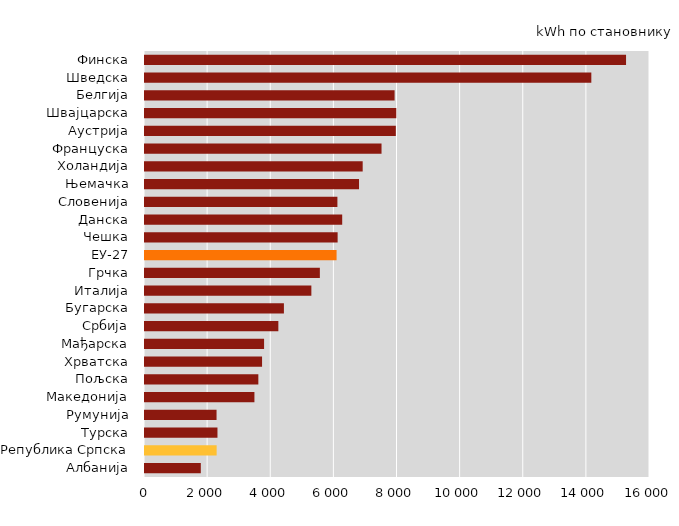
| Category | Electricity Consumption / Population(kWh/capita)2009 |
|---|---|
| Албанија | 1768 |
| Република Српска | 2270 |
| Турска | 2296 |
| Румунија | 2267 |
| Македонија | 3467 |
| Пољска | 3591 |
| Хрватска | 3709 |
| Мађарска | 3773 |
| Србија | 4225 |
| Бугарска | 4401 |
| Италија | 5271 |
| Грчка | 5540 |
| ЕУ-27 | 6070 |
| Чешка | 6103 |
| Данска | 6248 |
| Словенија | 6096 |
| Њемачка | 6781 |
| Холандија | 6897 |
| Француска | 7494 |
| Аустрија | 7947 |
| Швајцарска | 7962 |
| Белгија | 7908 |
| Шведска | 14141 |
| Финска | 15241 |